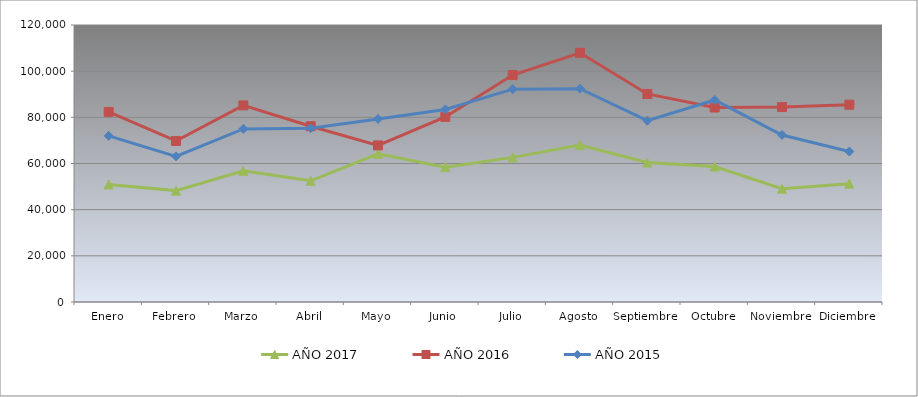
| Category | AÑO 2017 | AÑO 2016 | AÑO 2015 |
|---|---|---|---|
| Enero | 50936.42 | 82341.813 | 71975.377 |
| Febrero | 48256.175 | 69764.185 | 63091.715 |
| Marzo | 56814.152 | 85167.423 | 74997.177 |
| Abril | 52515.571 | 76139.975 | 75311.759 |
| Mayo | 64171.112 | 67841.289 | 79312.756 |
| Junio | 58432.487 | 80185.551 | 83419.622 |
| Julio | 62658.576 | 98308.289 | 92196.892 |
| Agosto | 67989.678 | 107949.909 | 92397.647 |
| Septiembre | 60426.997 | 90127.584 | 78533.597 |
| Octubre | 58702.863 | 84240.427 | 87516.186 |
| Noviembre | 49073.179 | 84453.993 | 72346.964 |
| Diciembre | 51273.41 | 85475.4 | 65164.889 |